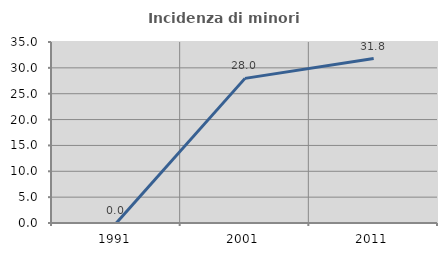
| Category | Incidenza di minori stranieri |
|---|---|
| 1991.0 | 0 |
| 2001.0 | 27.966 |
| 2011.0 | 31.802 |